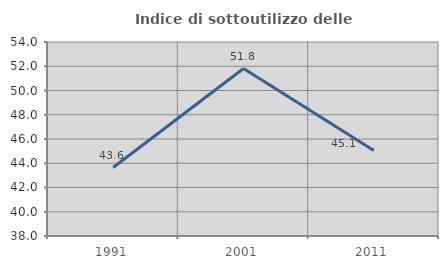
| Category | Indice di sottoutilizzo delle abitazioni  |
|---|---|
| 1991.0 | 43.648 |
| 2001.0 | 51.812 |
| 2011.0 | 45.053 |